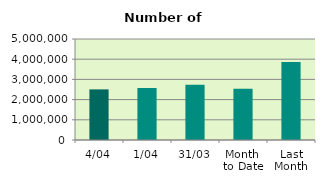
| Category | Series 0 |
|---|---|
| 4/04 | 2505836 |
| 1/04 | 2575358 |
| 31/03 | 2733486 |
| Month 
to Date | 2540597 |
| Last
Month | 3862771.739 |